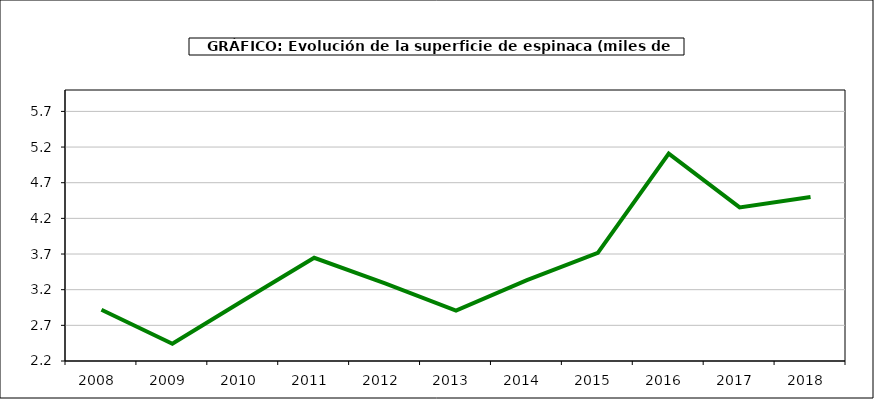
| Category | superficie |
|---|---|
| 2008.0 | 2.919 |
| 2009.0 | 2.441 |
| 2010.0 | 3.049 |
| 2011.0 | 3.647 |
| 2012.0 | 3.289 |
| 2013.0 | 2.908 |
| 2014.0 | 3.335 |
| 2015.0 | 3.717 |
| 2016.0 | 5.108 |
| 2017.0 | 4.353 |
| 2018.0 | 4.501 |